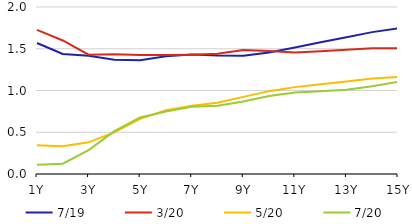
| Category | 7/19 | 3/20 | 5/20 | 7/20 |
|---|---|---|---|---|
|  1Y | 1.568 | 1.726 | 0.344 | 0.111 |
|  2Y | 1.437 | 1.599 | 0.332 | 0.123 |
|  3Y | 1.416 | 1.429 | 0.379 | 0.286 |
|  4Y | 1.37 | 1.435 | 0.499 | 0.512 |
|  5Y | 1.363 | 1.425 | 0.66 | 0.678 |
|  6Y | 1.411 | 1.425 | 0.764 | 0.748 |
|  7Y | 1.431 | 1.429 | 0.819 | 0.806 |
|  8Y | 1.42 | 1.439 | 0.854 | 0.818 |
|  9Y | 1.417 | 1.486 | 0.923 | 0.869 |
|  10Y | 1.456 | 1.474 | 0.992 | 0.934 |
|  11Y | 1.516 | 1.454 | 1.04 | 0.977 |
|  12Y | 1.577 | 1.471 | 1.074 | 0.992 |
|  13Y | 1.638 | 1.488 | 1.108 | 1.008 |
|  14Y | 1.699 | 1.505 | 1.143 | 1.052 |
|  15Y | 1.744 | 1.506 | 1.162 | 1.104 |